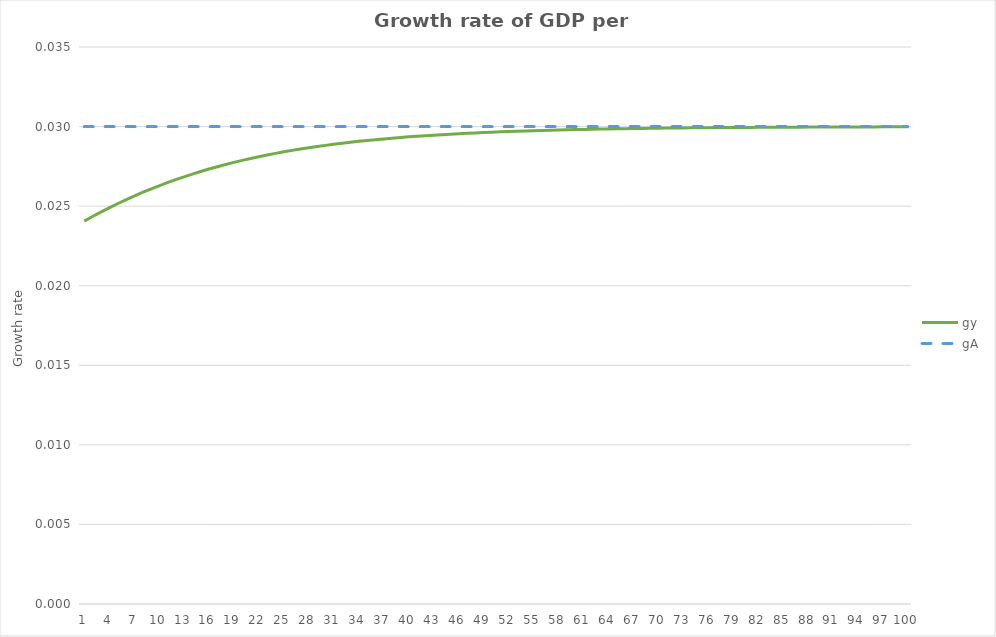
| Category | gy | gA |
|---|---|---|
| 0 | 0.024 | 0.03 |
| 1 | 0.024 | 0.03 |
| 2 | 0.025 | 0.03 |
| 3 | 0.025 | 0.03 |
| 4 | 0.025 | 0.03 |
| 5 | 0.025 | 0.03 |
| 6 | 0.026 | 0.03 |
| 7 | 0.026 | 0.03 |
| 8 | 0.026 | 0.03 |
| 9 | 0.026 | 0.03 |
| 10 | 0.026 | 0.03 |
| 11 | 0.027 | 0.03 |
| 12 | 0.027 | 0.03 |
| 13 | 0.027 | 0.03 |
| 14 | 0.027 | 0.03 |
| 15 | 0.027 | 0.03 |
| 16 | 0.027 | 0.03 |
| 17 | 0.028 | 0.03 |
| 18 | 0.028 | 0.03 |
| 19 | 0.028 | 0.03 |
| 20 | 0.028 | 0.03 |
| 21 | 0.028 | 0.03 |
| 22 | 0.028 | 0.03 |
| 23 | 0.028 | 0.03 |
| 24 | 0.028 | 0.03 |
| 25 | 0.029 | 0.03 |
| 26 | 0.029 | 0.03 |
| 27 | 0.029 | 0.03 |
| 28 | 0.029 | 0.03 |
| 29 | 0.029 | 0.03 |
| 30 | 0.029 | 0.03 |
| 31 | 0.029 | 0.03 |
| 32 | 0.029 | 0.03 |
| 33 | 0.029 | 0.03 |
| 34 | 0.029 | 0.03 |
| 35 | 0.029 | 0.03 |
| 36 | 0.029 | 0.03 |
| 37 | 0.029 | 0.03 |
| 38 | 0.029 | 0.03 |
| 39 | 0.029 | 0.03 |
| 40 | 0.029 | 0.03 |
| 41 | 0.029 | 0.03 |
| 42 | 0.029 | 0.03 |
| 43 | 0.029 | 0.03 |
| 44 | 0.03 | 0.03 |
| 45 | 0.03 | 0.03 |
| 46 | 0.03 | 0.03 |
| 47 | 0.03 | 0.03 |
| 48 | 0.03 | 0.03 |
| 49 | 0.03 | 0.03 |
| 50 | 0.03 | 0.03 |
| 51 | 0.03 | 0.03 |
| 52 | 0.03 | 0.03 |
| 53 | 0.03 | 0.03 |
| 54 | 0.03 | 0.03 |
| 55 | 0.03 | 0.03 |
| 56 | 0.03 | 0.03 |
| 57 | 0.03 | 0.03 |
| 58 | 0.03 | 0.03 |
| 59 | 0.03 | 0.03 |
| 60 | 0.03 | 0.03 |
| 61 | 0.03 | 0.03 |
| 62 | 0.03 | 0.03 |
| 63 | 0.03 | 0.03 |
| 64 | 0.03 | 0.03 |
| 65 | 0.03 | 0.03 |
| 66 | 0.03 | 0.03 |
| 67 | 0.03 | 0.03 |
| 68 | 0.03 | 0.03 |
| 69 | 0.03 | 0.03 |
| 70 | 0.03 | 0.03 |
| 71 | 0.03 | 0.03 |
| 72 | 0.03 | 0.03 |
| 73 | 0.03 | 0.03 |
| 74 | 0.03 | 0.03 |
| 75 | 0.03 | 0.03 |
| 76 | 0.03 | 0.03 |
| 77 | 0.03 | 0.03 |
| 78 | 0.03 | 0.03 |
| 79 | 0.03 | 0.03 |
| 80 | 0.03 | 0.03 |
| 81 | 0.03 | 0.03 |
| 82 | 0.03 | 0.03 |
| 83 | 0.03 | 0.03 |
| 84 | 0.03 | 0.03 |
| 85 | 0.03 | 0.03 |
| 86 | 0.03 | 0.03 |
| 87 | 0.03 | 0.03 |
| 88 | 0.03 | 0.03 |
| 89 | 0.03 | 0.03 |
| 90 | 0.03 | 0.03 |
| 91 | 0.03 | 0.03 |
| 92 | 0.03 | 0.03 |
| 93 | 0.03 | 0.03 |
| 94 | 0.03 | 0.03 |
| 95 | 0.03 | 0.03 |
| 96 | 0.03 | 0.03 |
| 97 | 0.03 | 0.03 |
| 98 | 0.03 | 0.03 |
| 99 | 0.03 | 0.03 |